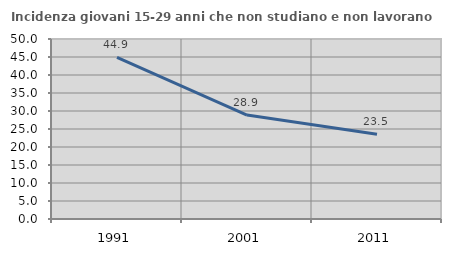
| Category | Incidenza giovani 15-29 anni che non studiano e non lavorano  |
|---|---|
| 1991.0 | 44.872 |
| 2001.0 | 28.875 |
| 2011.0 | 23.522 |